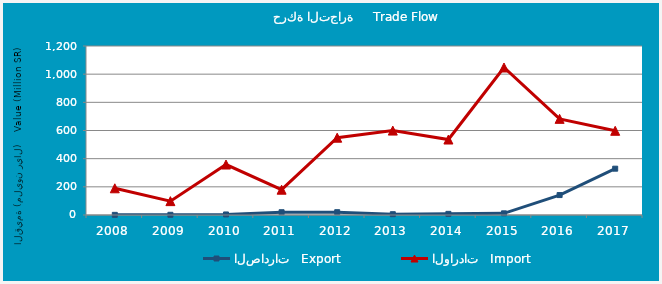
| Category | الصادرات   Export | الواردات   Import |
|---|---|---|
| 2008.0 | 1103425 | 189680954 |
| 2009.0 | 1480936 | 98465546 |
| 2010.0 | 3808889 | 358437409 |
| 2011.0 | 19697625 | 179707054 |
| 2012.0 | 19927933 | 548947497 |
| 2013.0 | 5661119 | 599389730 |
| 2014.0 | 8205860 | 535974236 |
| 2015.0 | 11840111 | 1047430399 |
| 2016.0 | 141541051 | 682666803 |
| 2017.0 | 328930885 | 597921030 |